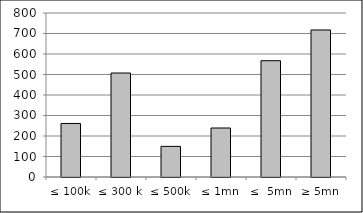
| Category | Series 0 |
|---|---|
| ≤ 100k | 261127718.509 |
| ≤ 300 k | 507227653.013 |
| ≤ 500k | 149412906.943 |
| ≤ 1mn | 239022941.031 |
| ≤  5mn | 567286653.385 |
| ≥ 5mn | 717294054.98 |